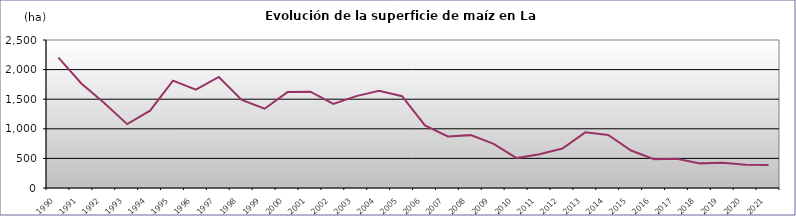
| Category | TOTAL |
|---|---|
| 1990.0 | 2203 |
| 1991.0 | 1765 |
| 1992.0 | 1437 |
| 1993.0 | 1079 |
| 1994.0 | 1306 |
| 1995.0 | 1814 |
| 1996.0 | 1660 |
| 1997.0 | 1875 |
| 1998.0 | 1488 |
| 1999.0 | 1339 |
| 2000.0 | 1620 |
| 2001.0 | 1626 |
| 2002.0 | 1419 |
| 2003.0 | 1552 |
| 2004.0 | 1642 |
| 2005.0 | 1551 |
| 2006.0 | 1058 |
| 2007.0 | 871 |
| 2008.0 | 893 |
| 2009.0 | 747 |
| 2010.0 | 505 |
| 2011.0 | 570 |
| 2012.0 | 668 |
| 2013.0 | 940 |
| 2014.0 | 896 |
| 2015.0 | 633 |
| 2016.0 | 487 |
| 2017.0 | 495 |
| 2018.0 | 416 |
| 2019.0 | 428 |
| 2020.0 | 394 |
| 2021.0 | 388 |